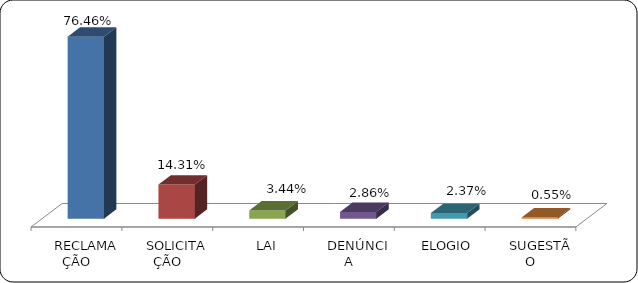
| Category | Series 0 |
|---|---|
|      RECLAMAÇÃO | 0.765 |
|      SOLICITAÇÃO | 0.143 |
|      LAI | 0.034 |
|      DENÚNCIA | 0.029 |
|      ELOGIO | 0.024 |
|      SUGESTÃO | 0.006 |